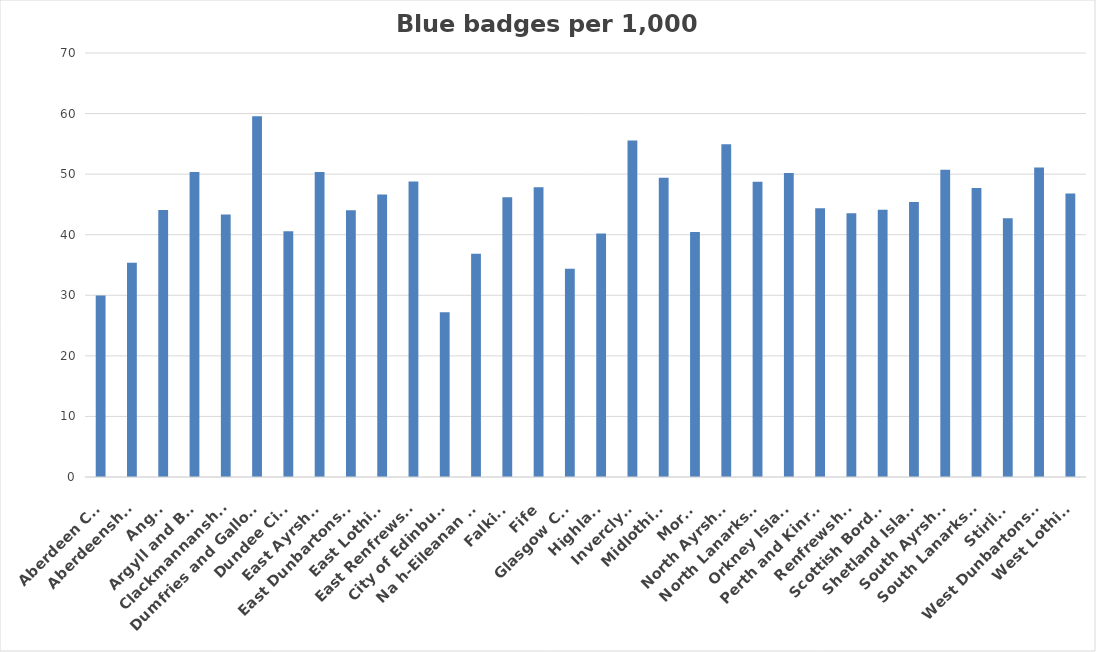
| Category | Rates |
|---|---|
| Aberdeen City | 29.97 |
| Aberdeenshire | 35.385 |
| Angus | 44.097 |
| Argyll and Bute | 50.359 |
| Clackmannanshire | 43.327 |
| Dumfries and Galloway | 59.567 |
| Dundee City | 40.558 |
| East Ayrshire | 50.345 |
| East Dunbartonshire | 44.051 |
| East Lothian | 46.64 |
| East Renfrewshire | 48.786 |
| City of Edinburgh | 27.207 |
| Na h-Eileanan Siar | 36.862 |
| Falkirk | 46.177 |
| Fife | 47.829 |
| Glasgow City | 34.372 |
| Highland | 40.205 |
| Inverclyde | 55.547 |
| Midlothian | 49.398 |
| Moray | 40.442 |
| North Ayrshire | 54.923 |
| North Lanarkshire | 48.757 |
| Orkney Islands | 50.203 |
| Perth and Kinross | 44.378 |
| Renfrewshire | 43.557 |
| Scottish Borders | 44.122 |
| Shetland Islands | 45.411 |
| South Ayrshire | 50.706 |
| South Lanarkshire | 47.712 |
| Stirling | 42.701 |
| West Dunbartonshire | 51.094 |
| West Lothian | 46.81 |